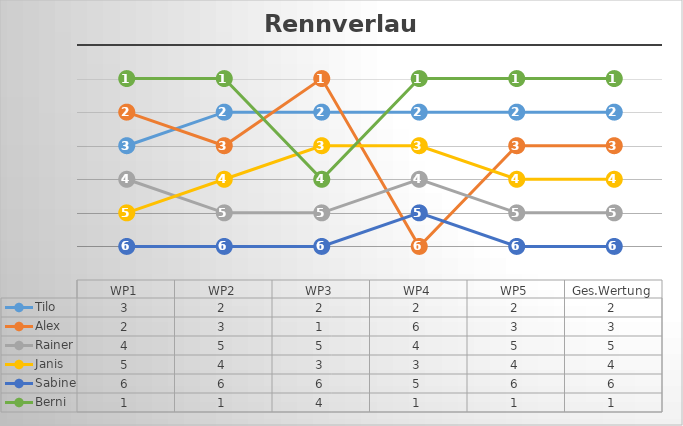
| Category | Tilo | Alex | Rainer | Janis | Sabine | Berni |
|---|---|---|---|---|---|---|
| WP1 | 3 | 2 | 4 | 5 | 6 | 1 |
| WP2 | 2 | 3 | 5 | 4 | 6 | 1 |
| WP3 | 2 | 1 | 5 | 3 | 6 | 4 |
| WP4 | 2 | 6 | 4 | 3 | 5 | 1 |
| WP5 | 2 | 3 | 5 | 4 | 6 | 1 |
| Ges.Wertung | 2 | 3 | 5 | 4 | 6 | 1 |